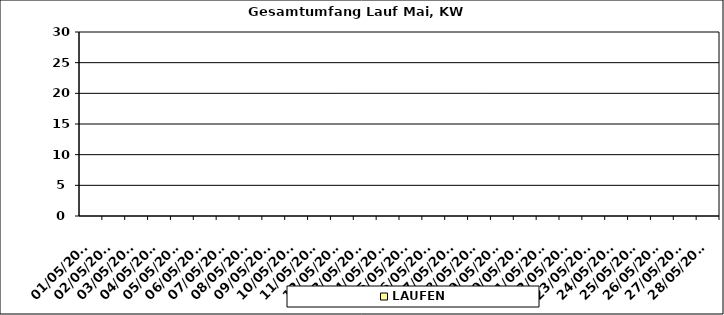
| Category | LAUFEN |
|---|---|
| 01/05/2023 | 0 |
| 02/05/2023 | 0 |
| 03/05/2023 | 0 |
| 04/05/2023 | 0 |
| 05/05/2023 | 0 |
| 06/05/2023 | 0 |
| 07/05/2023 | 0 |
| 08/05/2023 | 0 |
| 09/05/2023 | 0 |
| 10/05/2023 | 0 |
| 11/05/2023 | 0 |
| 12/05/2023 | 0 |
| 13/05/2023 | 0 |
| 14/05/2023 | 0 |
| 15/05/2023 | 0 |
| 16/05/2023 | 0 |
| 17/05/2023 | 0 |
| 18/05/2023 | 0 |
| 19/05/2023 | 0 |
| 20/05/2023 | 0 |
| 21/05/2023 | 0 |
| 22/05/2023 | 0 |
| 23/05/2023 | 0 |
| 24/05/2023 | 0 |
| 25/05/2023 | 0 |
| 26/05/2023 | 0 |
| 27/05/2023 | 0 |
| 28/05/2023 | 0 |